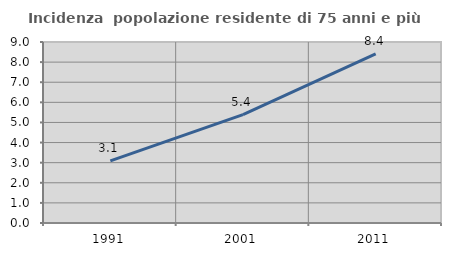
| Category | Incidenza  popolazione residente di 75 anni e più |
|---|---|
| 1991.0 | 3.088 |
| 2001.0 | 5.387 |
| 2011.0 | 8.406 |